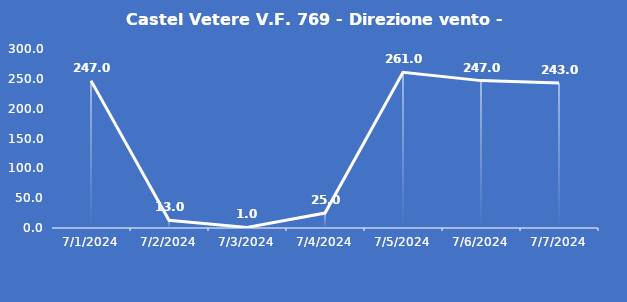
| Category | Castel Vetere V.F. 769 - Direzione vento - Grezzo (°N) |
|---|---|
| 7/1/24 | 247 |
| 7/2/24 | 13 |
| 7/3/24 | 1 |
| 7/4/24 | 25 |
| 7/5/24 | 261 |
| 7/6/24 | 247 |
| 7/7/24 | 243 |